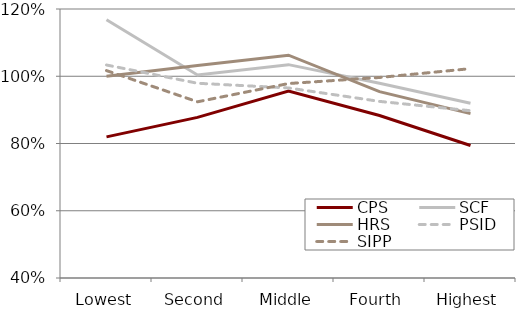
| Category | CPS | SCF | HRS | PSID | SIPP |
|---|---|---|---|---|---|
| Lowest | 0.82 | 1.168 | 1 | 1.033 | 1.017 |
| Second | 0.878 | 1.004 | 1.032 | 0.979 | 0.924 |
| Middle | 0.956 | 1.035 | 1.063 | 0.965 | 0.978 |
| Fourth | 0.883 | 0.979 | 0.954 | 0.925 | 0.996 |
| Highest | 0.794 | 0.92 | 0.889 | 0.897 | 1.023 |